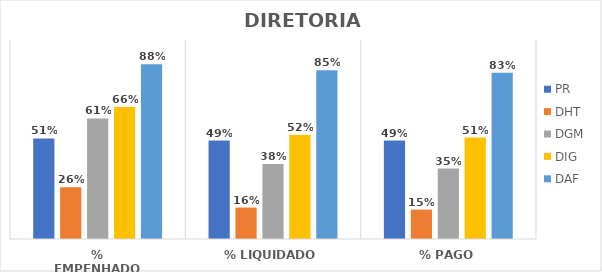
| Category | PR | DHT | DGM | DIG | DAF |
|---|---|---|---|---|---|
| % EMPENHADO | 0.506 | 0.26 | 0.606 | 0.664 | 0.879 |
| % LIQUIDADO | 0.495 | 0.158 | 0.377 | 0.523 | 0.848 |
| % PAGO | 0.495 | 0.148 | 0.354 | 0.51 | 0.835 |